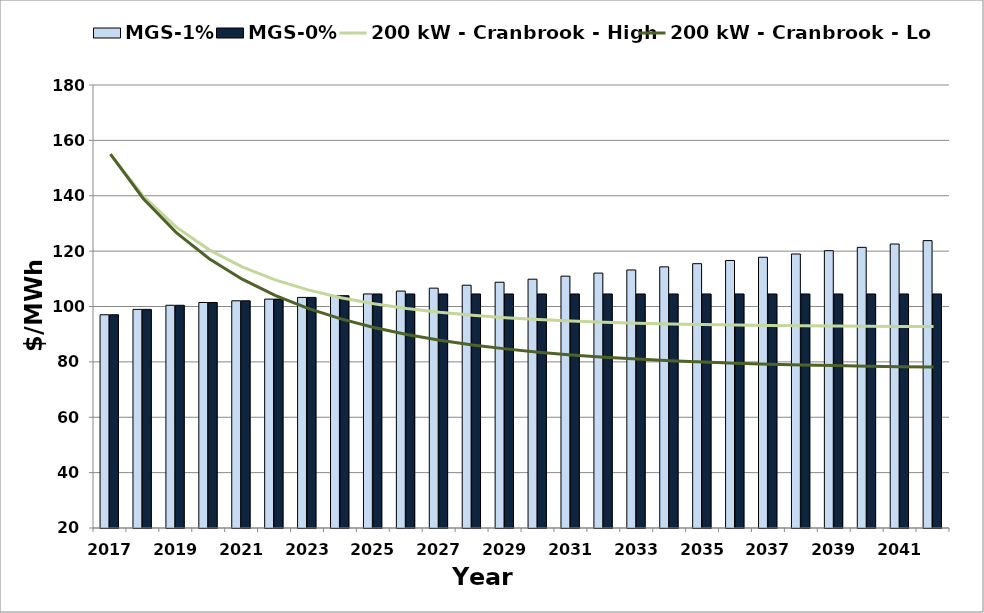
| Category | MGS-1% | MGS-0% |
|---|---|---|
| 2017.0 | 97.02 | 97.02 |
| 2018.0 | 98.96 | 98.96 |
| 2019.0 | 100.445 | 100.445 |
| 2020.0 | 101.449 | 101.449 |
| 2021.0 | 102.058 | 102.058 |
| 2022.0 | 102.67 | 102.67 |
| 2023.0 | 103.286 | 103.286 |
| 2024.0 | 103.906 | 103.906 |
| 2025.0 | 104.529 | 104.529 |
| 2026.0 | 105.575 | 104.529 |
| 2027.0 | 106.631 | 104.529 |
| 2028.0 | 107.697 | 104.529 |
| 2029.0 | 108.774 | 104.529 |
| 2030.0 | 109.862 | 104.529 |
| 2031.0 | 110.96 | 104.529 |
| 2032.0 | 112.07 | 104.529 |
| 2033.0 | 113.19 | 104.529 |
| 2034.0 | 114.322 | 104.529 |
| 2035.0 | 115.466 | 104.529 |
| 2036.0 | 116.62 | 104.529 |
| 2037.0 | 117.786 | 104.529 |
| 2038.0 | 118.964 | 104.529 |
| 2039.0 | 120.154 | 104.529 |
| 2040.0 | 121.355 | 104.529 |
| 2041.0 | 122.569 | 104.529 |
| 2042.0 | 123.795 | 104.529 |